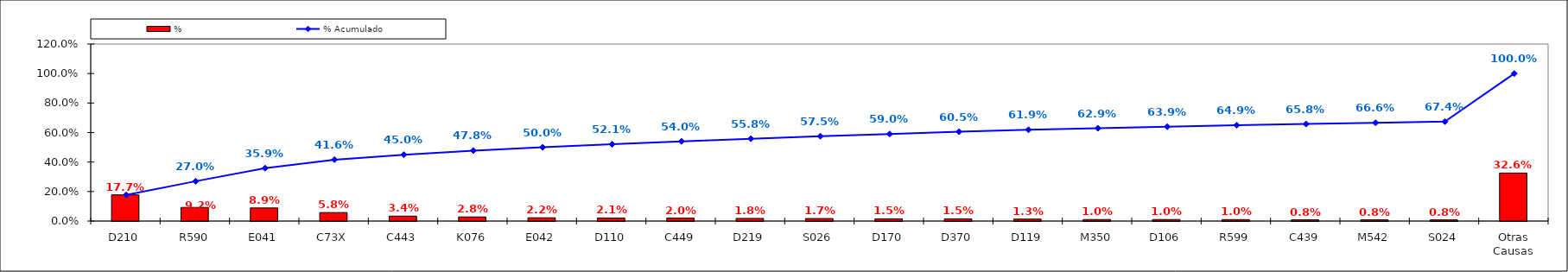
| Category | % |
|---|---|
| D210 | 0.177 |
| R590 | 0.092 |
| E041 | 0.089 |
| C73X | 0.058 |
| C443 | 0.034 |
| K076 | 0.028 |
| E042 | 0.022 |
| D110 | 0.021 |
| C449 | 0.02 |
| D219 | 0.018 |
| S026 | 0.017 |
| D170 | 0.015 |
| D370 | 0.015 |
| D119 | 0.013 |
| M350 | 0.01 |
| D106 | 0.01 |
| R599 | 0.01 |
| C439 | 0.008 |
| M542 | 0.008 |
| S024 | 0.008 |
| Otras Causas | 0.326 |